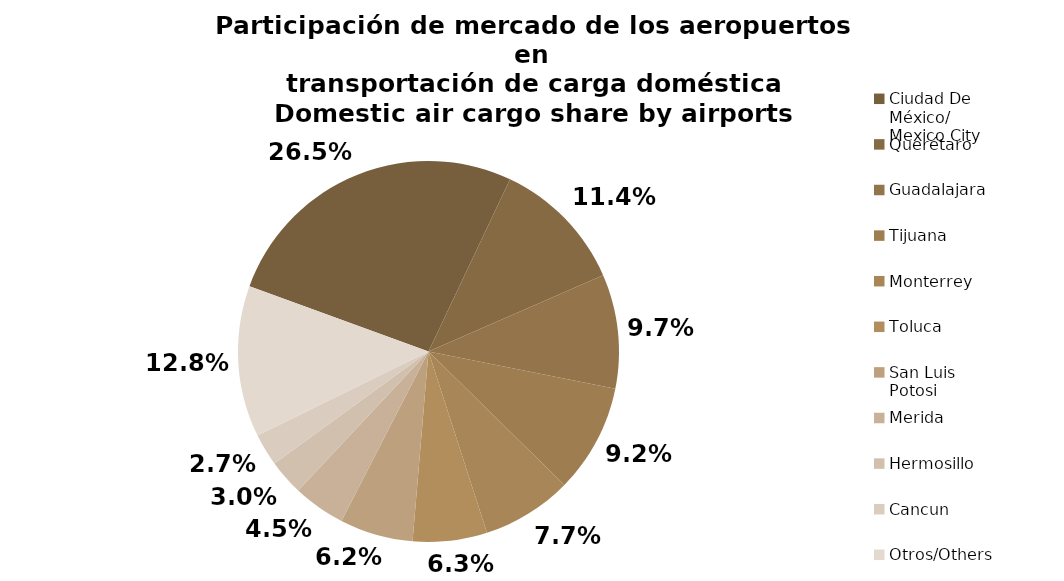
| Category | Series 0 |
|---|---|
| Ciudad De 
México/
Mexico City | 9392.057 |
| Querétaro | 4045.377 |
| Guadalajara | 3438.043 |
| Tijuana | 3268.534 |
| Monterrey | 2721.942 |
| Toluca | 2234.589 |
| San Luis 
Potosi | 2204.482 |
| Merida | 1571.751 |
| Hermosillo | 1067.345 |
| Cancun | 968.66 |
| Otros/Others | 4550.106 |